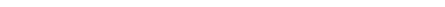
| Category | budget | end of year projected spend |
|---|---|---|
| clerk | 9000 | 0 |
| Admin | 2000 | 0 |
| St Michaels | 290 | 0 |
| RBWM | 200 | 0 |
| greens | 10000 | 0 |
| insurance | 2000 | 0 |
| youth | 700 | 0 |
| One off | 1250 | 5000 |
| web | 700 | 0 |
| hpss | 1 | 1 |
| bank charges | 84 | 72 |
| audit | 750 | 0 |
| Champney | 350 | 6925 |